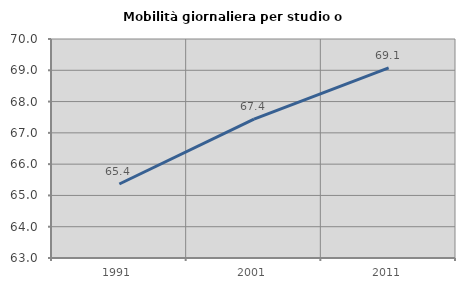
| Category | Mobilità giornaliera per studio o lavoro |
|---|---|
| 1991.0 | 65.365 |
| 2001.0 | 67.439 |
| 2011.0 | 69.079 |